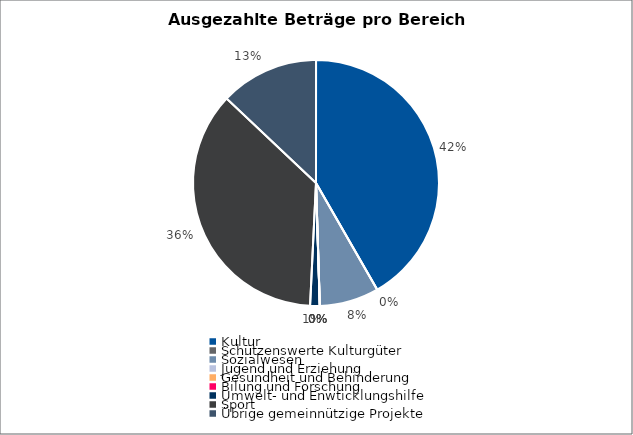
| Category | Series 0 |
|---|---|
| Kultur | 8323026 |
| Schützenswerte Kulturgüter | 0 |
| Sozialwesen | 1556411 |
| Jugend und Erziehung | 0 |
| Gesundheit und Behinderung | 0 |
| Bilung und Forschung | 0 |
| Umwelt- und Enwticklungshilfe | 250000 |
| Sport | 7239657 |
| Übrige gemeinnützige Projekte | 2587864 |